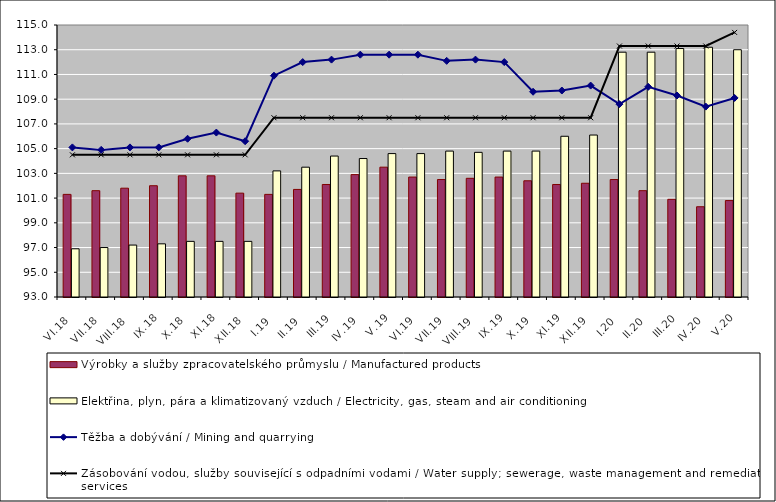
| Category | Výrobky a služby zpracovatelského průmyslu / Manufactured products | Elektřina, plyn, pára a klimatizovaný vzduch / Electricity, gas, steam and air conditioning |
|---|---|---|
| VI.18 | 101.3 | 96.9 |
| VII.18 | 101.6 | 97 |
| VIII.18 | 101.8 | 97.2 |
| IX.18 | 102 | 97.3 |
| X.18 | 102.8 | 97.5 |
| XI.18 | 102.8 | 97.5 |
| XII.18 | 101.4 | 97.5 |
| I.19 | 101.3 | 103.2 |
| II.19 | 101.7 | 103.5 |
| III.19 | 102.1 | 104.4 |
| IV.19 | 102.9 | 104.2 |
| V.19 | 103.5 | 104.6 |
| VI.19 | 102.7 | 104.6 |
| VII.19 | 102.5 | 104.8 |
| VIII.19 | 102.6 | 104.7 |
| IX.19 | 102.7 | 104.8 |
| X.19 | 102.4 | 104.8 |
| XI.19 | 102.1 | 106 |
| XII.19 | 102.2 | 106.1 |
| I.20 | 102.5 | 112.8 |
| II.20 | 101.6 | 112.8 |
| III.20 | 100.9 | 113.1 |
| IV.20 | 100.3 | 113.2 |
| V.20 | 100.8 | 113 |